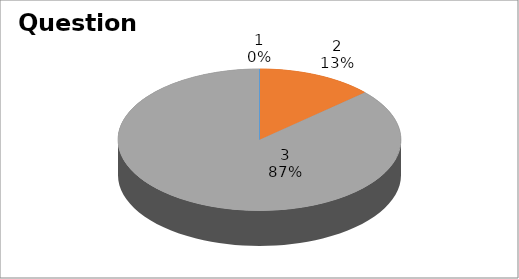
| Category | Series 0 |
|---|---|
| 0 | 0 |
| 1 | 8 |
| 2 | 52 |